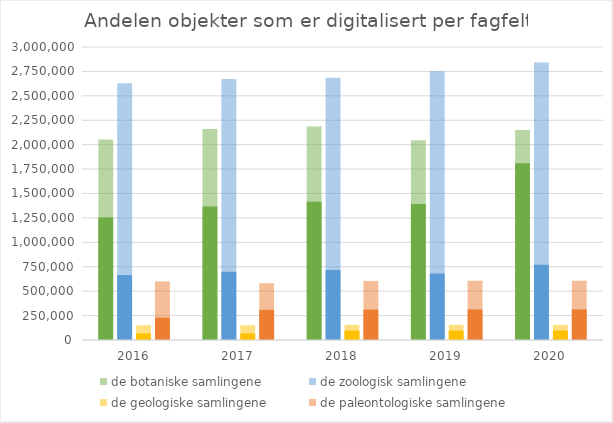
| Category | de botaniske samlingene | de zoologisk samlingene | de geologiske samlingene | de paleontologiske samlingene |
|---|---|---|---|---|
| 2016.0 | 2053120 | 2628722 | 151876 | 600254 |
| 2017.0 | 2159749 | 2672595 | 151876 | 581779 |
| 2018.0 | 2185343 | 2685657 | 155723 | 605047 |
| 2019.0 | 2044208 | 2752544 | 155723 | 606935 |
| 2020.0 | 2150575 | 2841841 | 155992 | 607135 |